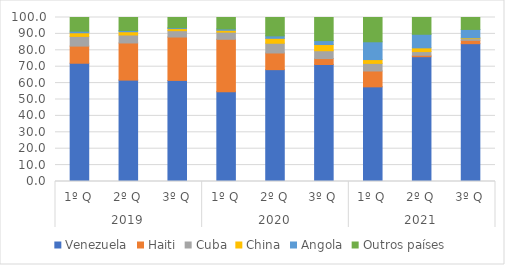
| Category | Venezuela | Haiti | Cuba | China | Angola | Outros países |
|---|---|---|---|---|---|---|
| 0 | 72.108 | 10.449 | 5.932 | 2.206 | 0.964 | 8.341 |
| 1 | 61.821 | 22.643 | 4.866 | 1.996 | 0.758 | 7.916 |
| 2 | 61.641 | 26.452 | 3.874 | 1.28 | 0.504 | 6.248 |
| 3 | 54.756 | 31.956 | 4.362 | 1.145 | 0.804 | 6.977 |
| 4 | 68.206 | 10.158 | 5.937 | 3.008 | 1.478 | 11.214 |
| 5 | 71.356 | 3.6 | 4.784 | 3.774 | 2.4 | 14.085 |
| 6 | 57.719 | 9.668 | 4.636 | 2.318 | 10.854 | 14.805 |
| 7 | 76.102 | 0.876 | 2.25 | 2.263 | 8.28 | 10.229 |
| 8 | 84.043 | 2.038 | 1.025 | 0.492 | 5.134 | 7.268 |